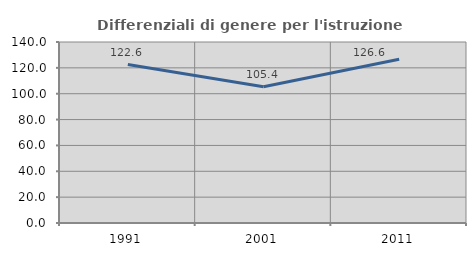
| Category | Differenziali di genere per l'istruzione superiore |
|---|---|
| 1991.0 | 122.567 |
| 2001.0 | 105.436 |
| 2011.0 | 126.636 |